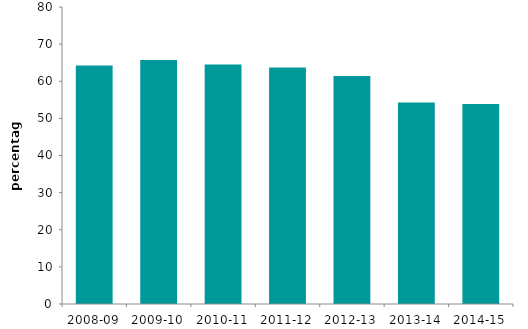
| Category | benefit covers rent |
|---|---|
| 2008-09 | 64.219 |
| 2009-10 | 65.733 |
| 2010-11 | 64.527 |
| 2011-12 | 63.674 |
| 2012-13 | 61.424 |
| 2013-14 | 54.28 |
| 2014-15 | 53.895 |